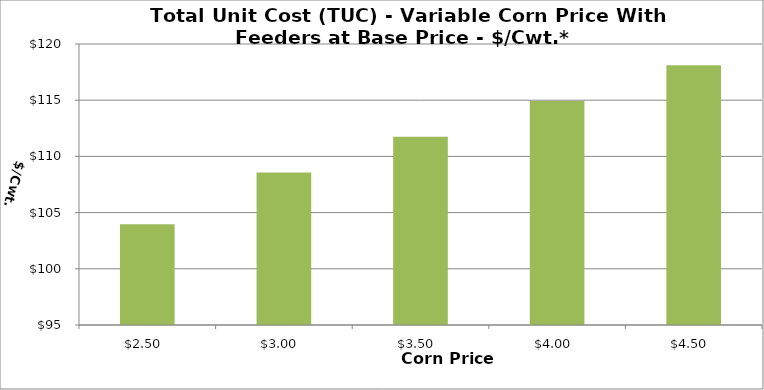
| Category | TUC |
|---|---|
| 2.5 | 103.962 |
| 3.0 | 108.572 |
| 3.5 | 111.753 |
| 4.0 | 114.934 |
| 4.5 | 118.114 |